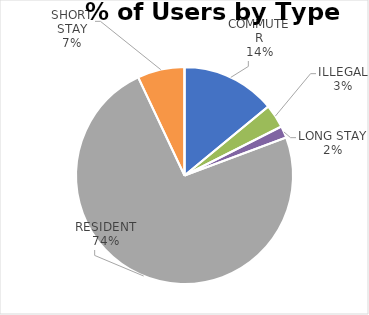
| Category | CAMBRIAN ROAD |
|---|---|
| COMMUTER | 8 |
| ILLEGAL | 2 |
| LONG STAY | 1 |
| RESIDENT | 42 |
| SHORT STAY | 4 |
| DISABLED | 0 |
| OTHER | 0 |